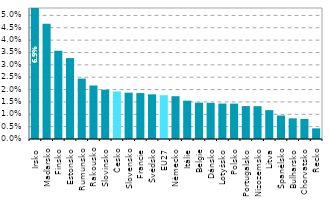
| Category | Series 0 |
|---|---|
| Irsko | 0.069 |
| Maďarsko | 0.047 |
| Finsko | 0.036 |
| Estonsko | 0.033 |
| Rumunsko | 0.024 |
| Rakousko | 0.022 |
| Slovinsko | 0.02 |
| Česko | 0.019 |
| Slovensko | 0.019 |
| Francie | 0.019 |
| Švédsko | 0.018 |
| EU27 | 0.018 |
| Německo | 0.017 |
| Itálie | 0.016 |
| Belgie | 0.015 |
| Dánsko | 0.015 |
| Lotyšsko | 0.014 |
| Polsko | 0.014 |
| Portugalsko | 0.013 |
| Nizozemsko | 0.013 |
| Litva | 0.012 |
| Španělsko | 0.009 |
| Bulharsko | 0.008 |
| Chorvatsko | 0.008 |
| Řecko | 0.004 |